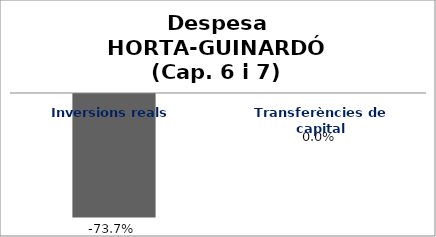
| Category | Series 0 |
|---|---|
| Inversions reals | -0.737 |
| Transferències de capital | 0 |